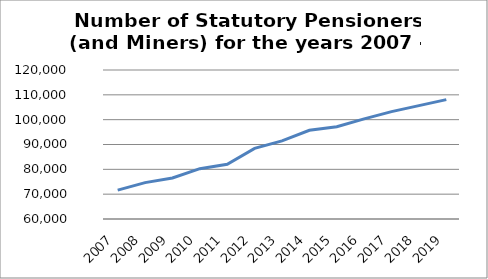
| Category | Series 1 | Series 0 |
|---|---|---|
| 2007.0 | 2007 | 71621 |
| 2008.0 | 2008 | 74642 |
| 2009.0 | 2009 | 76508 |
| 2010.0 | 2010 | 80261 |
| 2011.0 | 2011 | 82038 |
| 2012.0 | 2012 | 88453 |
| 2013.0 | 2013 | 91472 |
| 2014.0 | 2014 | 95747 |
| 2015.0 | 2015 | 97134 |
| 2016.0 | 2016 | 100305 |
| 2017.0 | 2017 | 103238 |
| 2018.0 | 2018 | 105648 |
| 2019.0 | 2019 | 108066 |